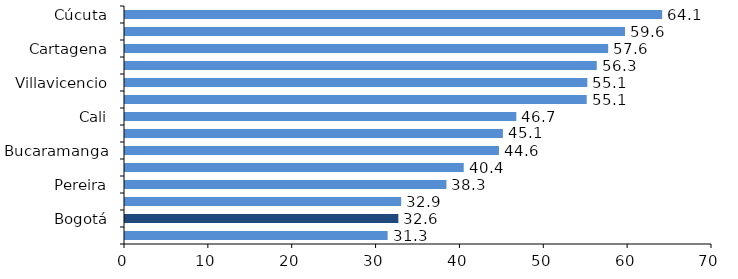
| Category | Series 0 |
|---|---|
| Cúcuta | 64.061 |
| Montería | 59.625 |
| Cartagena | 57.619 |
| Pasto | 56.257 |
| Villavicencio | 55.129 |
| Barranquilla | 55.06 |
| Cali | 46.664 |
| Ibagué | 45.065 |
| Bucaramanga | 44.594 |
| Total 13 áreas | 40.392 |
| Pereira | 38.331 |
| Medellín | 32.935 |
| Bogotá | 32.598 |
| Manizales | 31.318 |